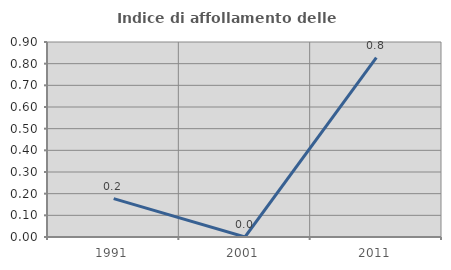
| Category | Indice di affollamento delle abitazioni  |
|---|---|
| 1991.0 | 0.177 |
| 2001.0 | 0 |
| 2011.0 | 0.828 |